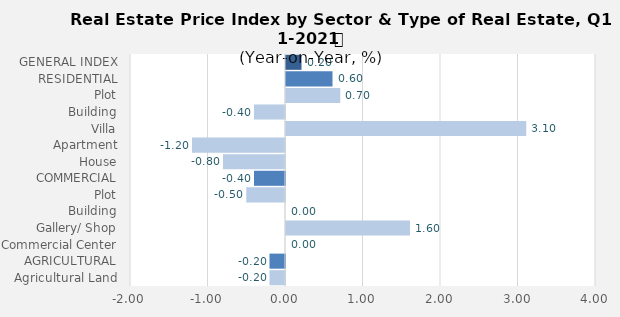
| Category | Q1- 2020 |
|---|---|
| GENERAL INDEX | 0.2 |
| RESIDENTIAL | 0.6 |
| Plot | 0.7 |
| Building | -0.4 |
| Villa | 3.1 |
| Apartment | -1.2 |
| House | -0.8 |
| COMMERCIAL | -0.4 |
| Plot | -0.5 |
| Building | 0 |
| Gallery/ Shop | 1.6 |
| Commercial Center | 0 |
| AGRICULTURAL | -0.2 |
| Agricultural Land | -0.2 |